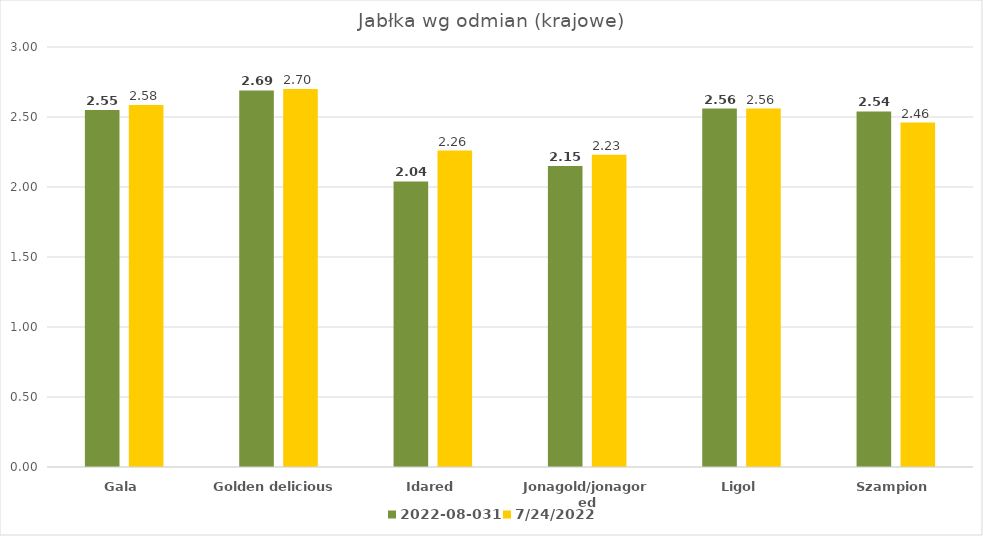
| Category | 2022-08-031 | 2022-07-24 |
|---|---|---|
| Gala | 2.55 | 2.585 |
| Golden delicious | 2.69 | 2.7 |
| Idared | 2.04 | 2.26 |
| Jonagold/jonagored | 2.15 | 2.23 |
| Ligol | 2.56 | 2.56 |
| Szampion | 2.54 | 2.46 |